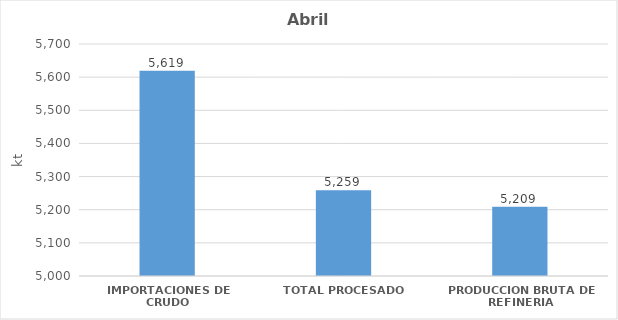
| Category | Series 0 |
|---|---|
| 0 | 5619.31 |
| 1 | 5258.757 |
| 2 | 5208.581 |